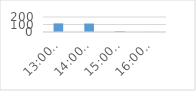
| Category | Series 0 |
|---|---|
| 13:00 Uhr | 115 |
| 14:00 Uhr | 113 |
| 15:00 Uhr  | 9 |
| 16:00 Uhr  | 1 |